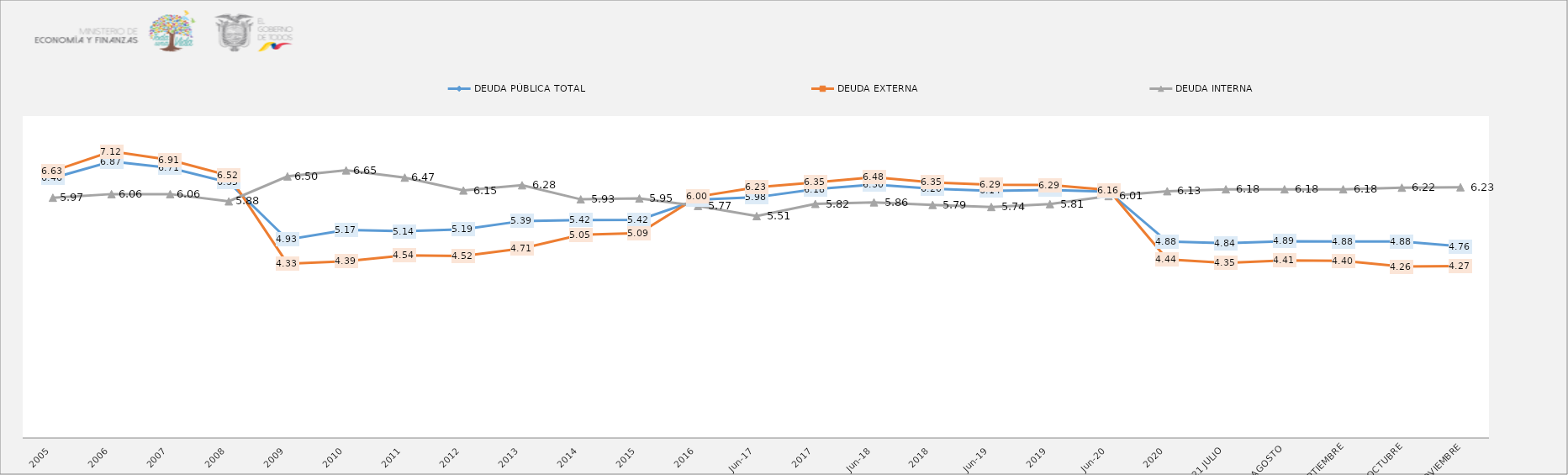
| Category | DEUDA PÚBLICA TOTAL | DEUDA EXTERNA  | DEUDA INTERNA |
|---|---|---|---|
| 2005 | 6.46 | 6.63 | 5.97 |
| 2006 | 6.87 | 7.12 | 6.06 |
| 2007 | 6.71 | 6.91 | 6.06 |
| 2008 | 6.35 | 6.52 | 5.88 |
| 2009 | 4.93 | 4.33 | 6.5 |
| 2010 | 5.17 | 4.39 | 6.65 |
| 2011 | 5.137 | 4.54 | 6.47 |
| 2012 | 5.186 | 4.521 | 6.15 |
| 2013 | 5.391 | 4.709 | 6.28 |
| 2014 | 5.416 | 5.048 | 5.93 |
| 2015 | 5.421 | 5.092 | 5.952 |
| 2016 | 5.922 | 5.998 | 5.767 |
| jun-17 | 5.982 | 6.228 | 5.513 |
| 2017 | 6.181 | 6.35 | 5.817 |
| jun-18 | 6.297 | 6.479 | 5.855 |
| 2018 | 6.195 | 6.35 | 5.792 |
| jun-19 | 6.143 | 6.29 | 5.74 |
| 2019 | 6.164 | 6.285 | 5.811 |
| jun-20 | 6.121 | 6.161 | 6.012 |
| 2020 | 4.881 | 4.437 | 6.132 |
| 2021 JULIO | 4.84 | 4.351 | 6.18 |
| 2021 AGOSTO | 4.89 | 4.41 | 6.18 |
| 2021 SEPTIEMBRE | 4.88 | 4.4 | 6.18 |
| 2021 OCTUBRE | 4.88 | 4.26 | 6.22 |
| 2021 NOVIEMBRE | 4.76 | 4.27 | 6.23 |